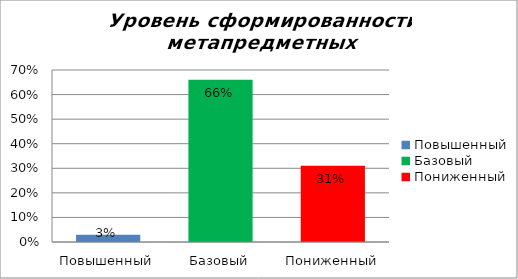
| Category | Уровень сформированности метапредметных результатов |
|---|---|
| Повышенный | 0.03 |
| Базовый | 0.66 |
| Пониженный | 0.31 |